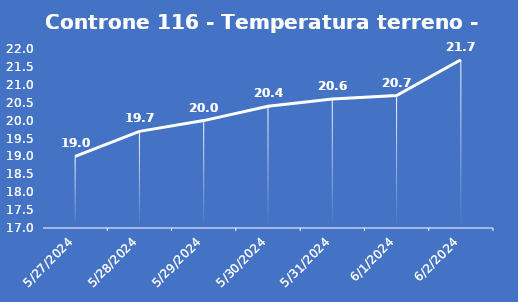
| Category | Controne 116 - Temperatura terreno - Grezzo (°C) |
|---|---|
| 5/27/24 | 19 |
| 5/28/24 | 19.7 |
| 5/29/24 | 20 |
| 5/30/24 | 20.4 |
| 5/31/24 | 20.6 |
| 6/1/24 | 20.7 |
| 6/2/24 | 21.7 |